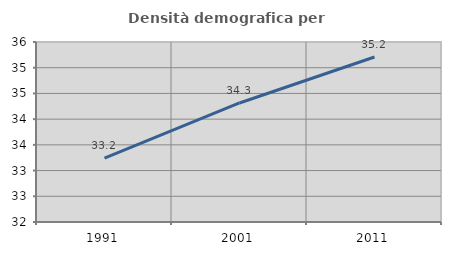
| Category | Densità demografica |
|---|---|
| 1991.0 | 33.242 |
| 2001.0 | 34.315 |
| 2011.0 | 35.208 |